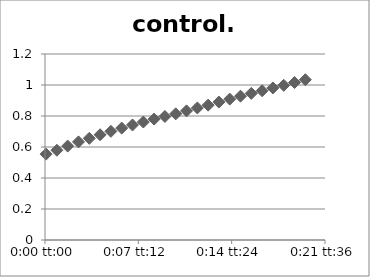
| Category | control.1 |
|---|---|
| 5.78703703703704e-05 | 0.554 |
| 0.000636574074074074 | 0.579 |
| 0.00121527777777778 | 0.606 |
| 0.00179398148148148 | 0.633 |
| 0.00237268518518518 | 0.656 |
| 0.00295138888888889 | 0.679 |
| 0.00353009259259259 | 0.701 |
| 0.0041087962962963 | 0.722 |
| 0.0046875 | 0.742 |
| 0.0052662037037037 | 0.761 |
| 0.00584490740740741 | 0.78 |
| 0.00642361111111111 | 0.797 |
| 0.00700231481481481 | 0.814 |
| 0.00758101851851852 | 0.833 |
| 0.00815972222222222 | 0.852 |
| 0.00873842592592592 | 0.87 |
| 0.00931712962962963 | 0.89 |
| 0.00989583333333333 | 0.909 |
| 0.010474537037037 | 0.928 |
| 0.0110532407407407 | 0.946 |
| 0.0116319444444444 | 0.963 |
| 0.0122106481481481 | 0.981 |
| 0.0127893518518518 | 0.998 |
| 0.0133680555555556 | 1.016 |
| 0.0139467592592593 | 1.034 |